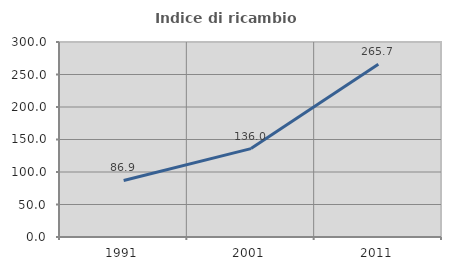
| Category | Indice di ricambio occupazionale  |
|---|---|
| 1991.0 | 86.927 |
| 2001.0 | 135.977 |
| 2011.0 | 265.72 |